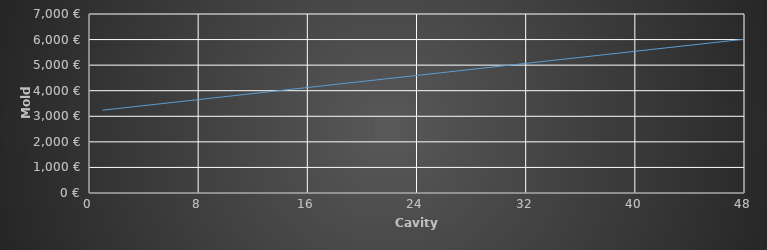
| Category | 1-50k*** |
|---|---|
| 1.0 | 3239 |
| 2.0 | 3298 |
| 4.0 | 3416 |
| 8.0 | 3652 |
| 16.0 | 4124 |
| 32.0 | 5068 |
| 48.0 | 6012 |